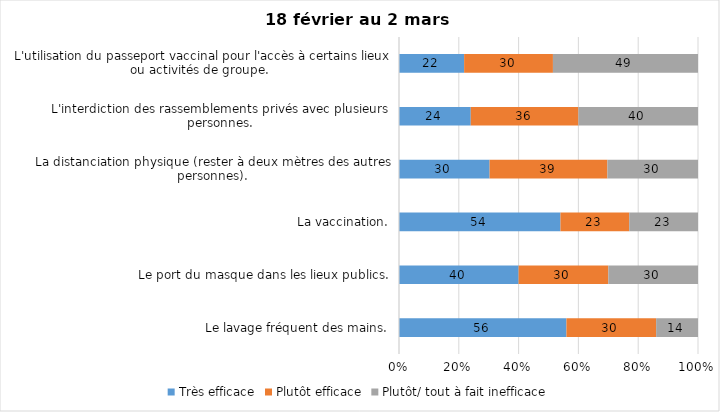
| Category | Très efficace | Plutôt efficace | Plutôt/ tout à fait inefficace |
|---|---|---|---|
| Le lavage fréquent des mains. | 56 | 30 | 14 |
| Le port du masque dans les lieux publics. | 40 | 30 | 30 |
| La vaccination. | 54 | 23 | 23 |
| La distanciation physique (rester à deux mètres des autres personnes). | 30 | 39 | 30 |
| L'interdiction des rassemblements privés avec plusieurs personnes. | 24 | 36 | 40 |
| L'utilisation du passeport vaccinal pour l'accès à certains lieux ou activités de groupe.  | 22 | 30 | 49 |